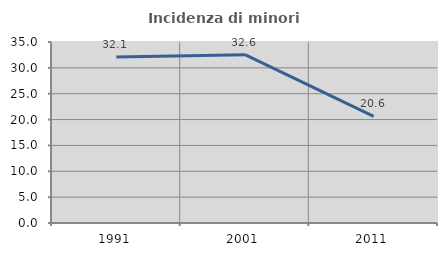
| Category | Incidenza di minori stranieri |
|---|---|
| 1991.0 | 32.075 |
| 2001.0 | 32.558 |
| 2011.0 | 20.611 |